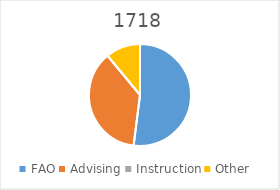
| Category | 1718 |
|---|---|
| FAO | 0.52 |
| Advising | 0.37 |
| Instruction | 0 |
| Other | 0.11 |